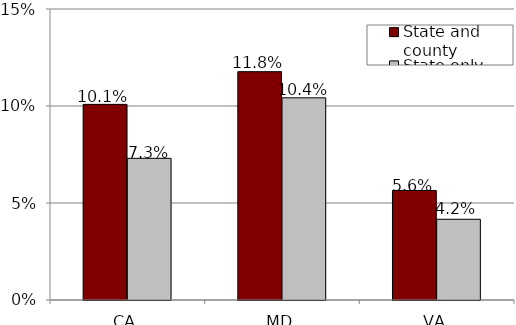
| Category | State and county | State only |
|---|---|---|
| CA | 0.101 | 0.073 |
| MD | 0.118 | 0.104 |
| VA | 0.056 | 0.042 |